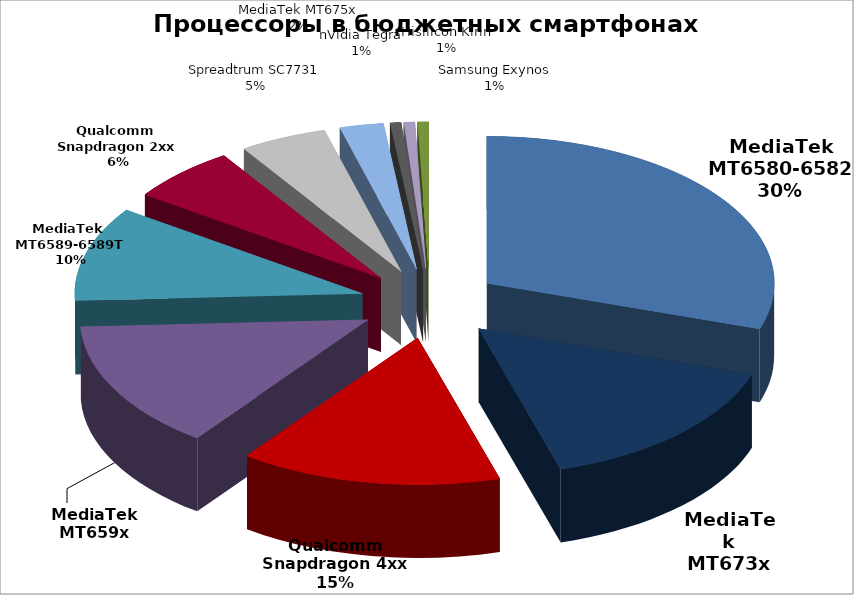
| Category | Series 0 |
|---|---|
| MediaTek MT6580-6582 | 49 |
| MediaTek MT673x | 25 |
| Qualcomm Snapdragon 4xx | 24 |
| MediaTek MT659x | 23 |
| MediaTek MT6589-6589T | 17 |
| Qualcomm Snapdragon 2xx | 10 |
| Spreadtrum SC7731 | 8 |
| MediaTek MT675x | 4 |
| nVidia Tegra | 1 |
| Hisilicon Kirin | 1 |
| Samsung Exynos | 1 |